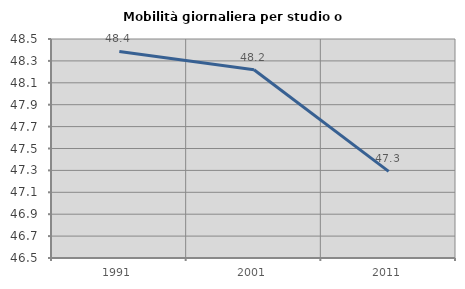
| Category | Mobilità giornaliera per studio o lavoro |
|---|---|
| 1991.0 | 48.386 |
| 2001.0 | 48.219 |
| 2011.0 | 47.291 |